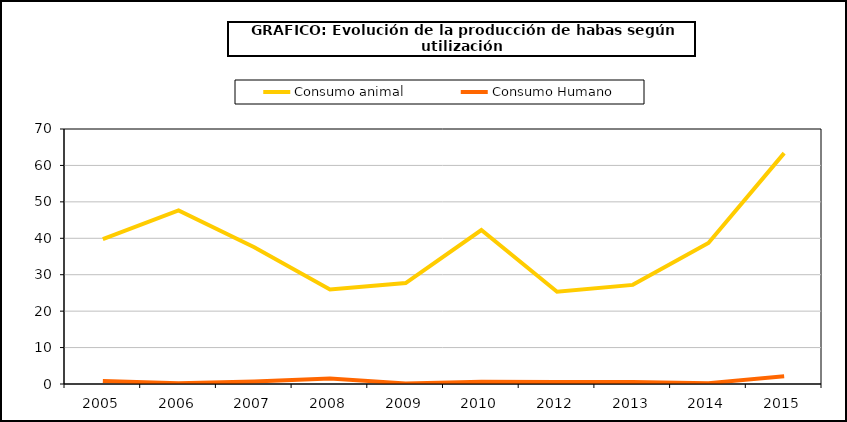
| Category | Consumo animal | Consumo Humano |
|---|---|---|
| 2005 | 39.775 | 0.81 |
| 2006 | 47.635 | 0.209 |
| 2007 | 37.523 | 0.661 |
| 2008 | 25.955 | 1.505 |
| 2009 | 27.701 | 0.165 |
| 2010 | 42.262 | 0.62 |
| 2012 | 25.317 | 0.571 |
| 2013 | 27.212 | 0.547 |
| 2014 | 38.703 | 0.238 |
| 2015 | 63.379 | 2.153 |